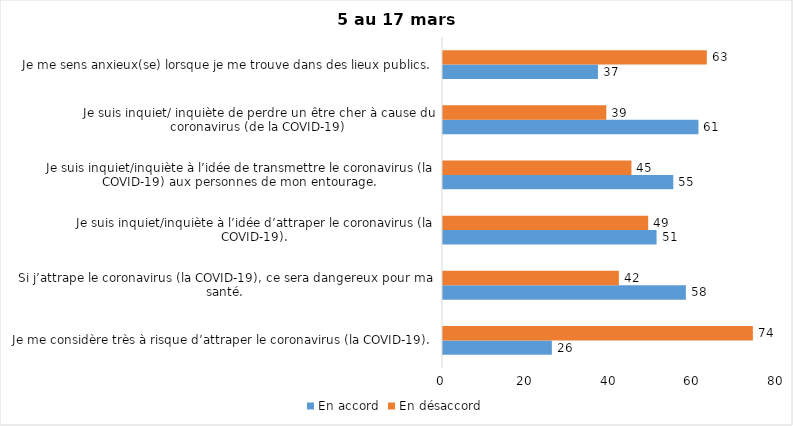
| Category | En accord | En désaccord |
|---|---|---|
| Je me considère très à risque d’attraper le coronavirus (la COVID-19). | 26 | 74 |
| Si j’attrape le coronavirus (la COVID-19), ce sera dangereux pour ma santé. | 58 | 42 |
| Je suis inquiet/inquiète à l’idée d’attraper le coronavirus (la COVID-19). | 51 | 49 |
| Je suis inquiet/inquiète à l’idée de transmettre le coronavirus (la COVID-19) aux personnes de mon entourage. | 55 | 45 |
| Je suis inquiet/ inquiète de perdre un être cher à cause du coronavirus (de la COVID-19) | 61 | 39 |
| Je me sens anxieux(se) lorsque je me trouve dans des lieux publics. | 37 | 63 |